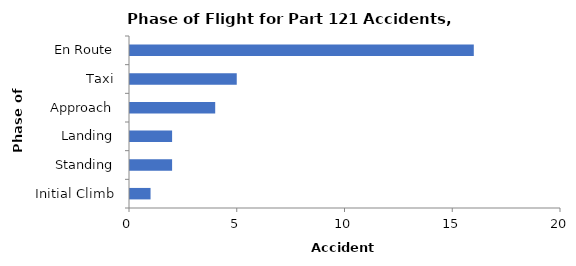
| Category | Accident Aircraft |
|---|---|
| En Route | 16 |
| Taxi | 5 |
| Approach | 4 |
| Landing | 2 |
| Standing | 2 |
| Initial Climb | 1 |